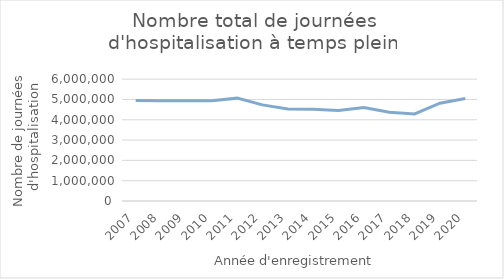
| Category | Nombre total de journées d'hospitalisation |
|---|---|
| 2007.0 | 4943332 |
| 2008.0 | 4936639 |
| 2009.0 | 4931662 |
| 2010.0 | 4930927 |
| 2011.0 | 5065341 |
| 2012.0 | 4733484 |
| 2013.0 | 4531693 |
| 2014.0 | 4519356 |
| 2015.0 | 4460641 |
| 2016.0 | 4604763 |
| 2017.0 | 4366462 |
| 2018.0 | 4287529 |
| 2019.0 | 4816574 |
| 2020.0 | 5046692 |